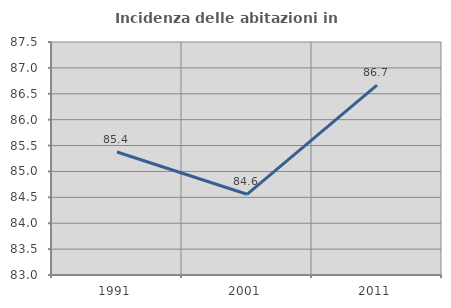
| Category | Incidenza delle abitazioni in proprietà  |
|---|---|
| 1991.0 | 85.375 |
| 2001.0 | 84.559 |
| 2011.0 | 86.667 |